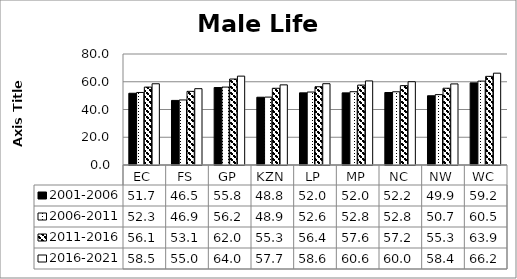
| Category | 2001-2006 | 2006-2011 | 2011-2016 | 2016-2021 |
|---|---|---|---|---|
| EC | 51.706 | 52.268 | 56.147 | 58.546 |
| FS | 46.548 | 46.876 | 53.076 | 55.003 |
| GP | 55.825 | 56.158 | 61.971 | 64.047 |
| KZN | 48.841 | 48.941 | 55.301 | 57.749 |
| LP | 52.013 | 52.585 | 56.415 | 58.584 |
| MP | 51.987 | 52.824 | 57.59 | 60.592 |
| NC | 52.244 | 52.777 | 57.191 | 60.024 |
| NW | 49.9 | 50.722 | 55.319 | 58.441 |
| WC | 59.195 | 60.455 | 63.887 | 66.176 |